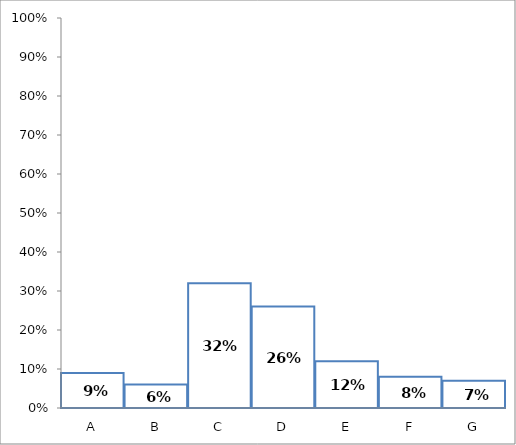
| Category | Series 0 |
|---|---|
| A | 0.09 |
| B | 0.06 |
| C | 0.32 |
| D | 0.26 |
| E | 0.12 |
| F | 0.08 |
| G | 0.07 |